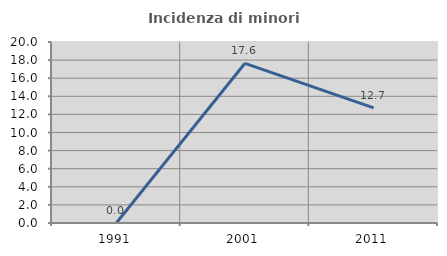
| Category | Incidenza di minori stranieri |
|---|---|
| 1991.0 | 0 |
| 2001.0 | 17.647 |
| 2011.0 | 12.727 |